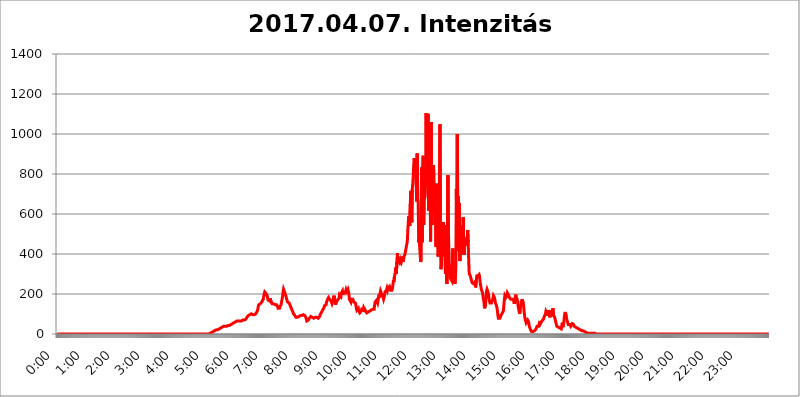
| Category | 2017.04.07. Intenzitás [W/m^2] |
|---|---|
| 0.0 | 0 |
| 0.0006944444444444445 | 0 |
| 0.001388888888888889 | 0 |
| 0.0020833333333333333 | 0 |
| 0.002777777777777778 | 0 |
| 0.003472222222222222 | 0 |
| 0.004166666666666667 | 0 |
| 0.004861111111111111 | 0 |
| 0.005555555555555556 | 0 |
| 0.0062499999999999995 | 0 |
| 0.006944444444444444 | 0 |
| 0.007638888888888889 | 0 |
| 0.008333333333333333 | 0 |
| 0.009027777777777779 | 0 |
| 0.009722222222222222 | 0 |
| 0.010416666666666666 | 0 |
| 0.011111111111111112 | 0 |
| 0.011805555555555555 | 0 |
| 0.012499999999999999 | 0 |
| 0.013194444444444444 | 0 |
| 0.013888888888888888 | 0 |
| 0.014583333333333332 | 0 |
| 0.015277777777777777 | 0 |
| 0.015972222222222224 | 0 |
| 0.016666666666666666 | 0 |
| 0.017361111111111112 | 0 |
| 0.018055555555555557 | 0 |
| 0.01875 | 0 |
| 0.019444444444444445 | 0 |
| 0.02013888888888889 | 0 |
| 0.020833333333333332 | 0 |
| 0.02152777777777778 | 0 |
| 0.022222222222222223 | 0 |
| 0.02291666666666667 | 0 |
| 0.02361111111111111 | 0 |
| 0.024305555555555556 | 0 |
| 0.024999999999999998 | 0 |
| 0.025694444444444447 | 0 |
| 0.02638888888888889 | 0 |
| 0.027083333333333334 | 0 |
| 0.027777777777777776 | 0 |
| 0.02847222222222222 | 0 |
| 0.029166666666666664 | 0 |
| 0.029861111111111113 | 0 |
| 0.030555555555555555 | 0 |
| 0.03125 | 0 |
| 0.03194444444444445 | 0 |
| 0.03263888888888889 | 0 |
| 0.03333333333333333 | 0 |
| 0.034027777777777775 | 0 |
| 0.034722222222222224 | 0 |
| 0.035416666666666666 | 0 |
| 0.036111111111111115 | 0 |
| 0.03680555555555556 | 0 |
| 0.0375 | 0 |
| 0.03819444444444444 | 0 |
| 0.03888888888888889 | 0 |
| 0.03958333333333333 | 0 |
| 0.04027777777777778 | 0 |
| 0.04097222222222222 | 0 |
| 0.041666666666666664 | 0 |
| 0.042361111111111106 | 0 |
| 0.04305555555555556 | 0 |
| 0.043750000000000004 | 0 |
| 0.044444444444444446 | 0 |
| 0.04513888888888889 | 0 |
| 0.04583333333333334 | 0 |
| 0.04652777777777778 | 0 |
| 0.04722222222222222 | 0 |
| 0.04791666666666666 | 0 |
| 0.04861111111111111 | 0 |
| 0.049305555555555554 | 0 |
| 0.049999999999999996 | 0 |
| 0.05069444444444445 | 0 |
| 0.051388888888888894 | 0 |
| 0.052083333333333336 | 0 |
| 0.05277777777777778 | 0 |
| 0.05347222222222222 | 0 |
| 0.05416666666666667 | 0 |
| 0.05486111111111111 | 0 |
| 0.05555555555555555 | 0 |
| 0.05625 | 0 |
| 0.05694444444444444 | 0 |
| 0.057638888888888885 | 0 |
| 0.05833333333333333 | 0 |
| 0.05902777777777778 | 0 |
| 0.059722222222222225 | 0 |
| 0.06041666666666667 | 0 |
| 0.061111111111111116 | 0 |
| 0.06180555555555556 | 0 |
| 0.0625 | 0 |
| 0.06319444444444444 | 0 |
| 0.06388888888888888 | 0 |
| 0.06458333333333334 | 0 |
| 0.06527777777777778 | 0 |
| 0.06597222222222222 | 0 |
| 0.06666666666666667 | 0 |
| 0.06736111111111111 | 0 |
| 0.06805555555555555 | 0 |
| 0.06874999999999999 | 0 |
| 0.06944444444444443 | 0 |
| 0.07013888888888889 | 0 |
| 0.07083333333333333 | 0 |
| 0.07152777777777779 | 0 |
| 0.07222222222222223 | 0 |
| 0.07291666666666667 | 0 |
| 0.07361111111111111 | 0 |
| 0.07430555555555556 | 0 |
| 0.075 | 0 |
| 0.07569444444444444 | 0 |
| 0.0763888888888889 | 0 |
| 0.07708333333333334 | 0 |
| 0.07777777777777778 | 0 |
| 0.07847222222222222 | 0 |
| 0.07916666666666666 | 0 |
| 0.0798611111111111 | 0 |
| 0.08055555555555556 | 0 |
| 0.08125 | 0 |
| 0.08194444444444444 | 0 |
| 0.08263888888888889 | 0 |
| 0.08333333333333333 | 0 |
| 0.08402777777777777 | 0 |
| 0.08472222222222221 | 0 |
| 0.08541666666666665 | 0 |
| 0.08611111111111112 | 0 |
| 0.08680555555555557 | 0 |
| 0.08750000000000001 | 0 |
| 0.08819444444444445 | 0 |
| 0.08888888888888889 | 0 |
| 0.08958333333333333 | 0 |
| 0.09027777777777778 | 0 |
| 0.09097222222222222 | 0 |
| 0.09166666666666667 | 0 |
| 0.09236111111111112 | 0 |
| 0.09305555555555556 | 0 |
| 0.09375 | 0 |
| 0.09444444444444444 | 0 |
| 0.09513888888888888 | 0 |
| 0.09583333333333333 | 0 |
| 0.09652777777777777 | 0 |
| 0.09722222222222222 | 0 |
| 0.09791666666666667 | 0 |
| 0.09861111111111111 | 0 |
| 0.09930555555555555 | 0 |
| 0.09999999999999999 | 0 |
| 0.10069444444444443 | 0 |
| 0.1013888888888889 | 0 |
| 0.10208333333333335 | 0 |
| 0.10277777777777779 | 0 |
| 0.10347222222222223 | 0 |
| 0.10416666666666667 | 0 |
| 0.10486111111111111 | 0 |
| 0.10555555555555556 | 0 |
| 0.10625 | 0 |
| 0.10694444444444444 | 0 |
| 0.1076388888888889 | 0 |
| 0.10833333333333334 | 0 |
| 0.10902777777777778 | 0 |
| 0.10972222222222222 | 0 |
| 0.1111111111111111 | 0 |
| 0.11180555555555556 | 0 |
| 0.11180555555555556 | 0 |
| 0.1125 | 0 |
| 0.11319444444444444 | 0 |
| 0.11388888888888889 | 0 |
| 0.11458333333333333 | 0 |
| 0.11527777777777777 | 0 |
| 0.11597222222222221 | 0 |
| 0.11666666666666665 | 0 |
| 0.1173611111111111 | 0 |
| 0.11805555555555557 | 0 |
| 0.11944444444444445 | 0 |
| 0.12013888888888889 | 0 |
| 0.12083333333333333 | 0 |
| 0.12152777777777778 | 0 |
| 0.12222222222222223 | 0 |
| 0.12291666666666667 | 0 |
| 0.12291666666666667 | 0 |
| 0.12361111111111112 | 0 |
| 0.12430555555555556 | 0 |
| 0.125 | 0 |
| 0.12569444444444444 | 0 |
| 0.12638888888888888 | 0 |
| 0.12708333333333333 | 0 |
| 0.16875 | 0 |
| 0.12847222222222224 | 0 |
| 0.12916666666666668 | 0 |
| 0.12986111111111112 | 0 |
| 0.13055555555555556 | 0 |
| 0.13125 | 0 |
| 0.13194444444444445 | 0 |
| 0.1326388888888889 | 0 |
| 0.13333333333333333 | 0 |
| 0.13402777777777777 | 0 |
| 0.13402777777777777 | 0 |
| 0.13472222222222222 | 0 |
| 0.13541666666666666 | 0 |
| 0.1361111111111111 | 0 |
| 0.13749999999999998 | 0 |
| 0.13819444444444443 | 0 |
| 0.1388888888888889 | 0 |
| 0.13958333333333334 | 0 |
| 0.14027777777777778 | 0 |
| 0.14097222222222222 | 0 |
| 0.14166666666666666 | 0 |
| 0.1423611111111111 | 0 |
| 0.14305555555555557 | 0 |
| 0.14375000000000002 | 0 |
| 0.14444444444444446 | 0 |
| 0.1451388888888889 | 0 |
| 0.1451388888888889 | 0 |
| 0.14652777777777778 | 0 |
| 0.14722222222222223 | 0 |
| 0.14791666666666667 | 0 |
| 0.1486111111111111 | 0 |
| 0.14930555555555555 | 0 |
| 0.15 | 0 |
| 0.15069444444444444 | 0 |
| 0.15138888888888888 | 0 |
| 0.15208333333333332 | 0 |
| 0.15277777777777776 | 0 |
| 0.15347222222222223 | 0 |
| 0.15416666666666667 | 0 |
| 0.15486111111111112 | 0 |
| 0.15555555555555556 | 0 |
| 0.15625 | 0 |
| 0.15694444444444444 | 0 |
| 0.15763888888888888 | 0 |
| 0.15833333333333333 | 0 |
| 0.15902777777777777 | 0 |
| 0.15972222222222224 | 0 |
| 0.16041666666666668 | 0 |
| 0.16111111111111112 | 0 |
| 0.16180555555555556 | 0 |
| 0.1625 | 0 |
| 0.16319444444444445 | 0 |
| 0.1638888888888889 | 0 |
| 0.16458333333333333 | 0 |
| 0.16527777777777777 | 0 |
| 0.16597222222222222 | 0 |
| 0.16666666666666666 | 0 |
| 0.1673611111111111 | 0 |
| 0.16805555555555554 | 0 |
| 0.16874999999999998 | 0 |
| 0.16944444444444443 | 0 |
| 0.17013888888888887 | 0 |
| 0.1708333333333333 | 0 |
| 0.17152777777777775 | 0 |
| 0.17222222222222225 | 0 |
| 0.1729166666666667 | 0 |
| 0.17361111111111113 | 0 |
| 0.17430555555555557 | 0 |
| 0.17500000000000002 | 0 |
| 0.17569444444444446 | 0 |
| 0.1763888888888889 | 0 |
| 0.17708333333333334 | 0 |
| 0.17777777777777778 | 0 |
| 0.17847222222222223 | 0 |
| 0.17916666666666667 | 0 |
| 0.1798611111111111 | 0 |
| 0.18055555555555555 | 0 |
| 0.18125 | 0 |
| 0.18194444444444444 | 0 |
| 0.1826388888888889 | 0 |
| 0.18333333333333335 | 0 |
| 0.1840277777777778 | 0 |
| 0.18472222222222223 | 0 |
| 0.18541666666666667 | 0 |
| 0.18611111111111112 | 0 |
| 0.18680555555555556 | 0 |
| 0.1875 | 0 |
| 0.18819444444444444 | 0 |
| 0.18888888888888888 | 0 |
| 0.18958333333333333 | 0 |
| 0.19027777777777777 | 0 |
| 0.1909722222222222 | 0 |
| 0.19166666666666665 | 0 |
| 0.19236111111111112 | 0 |
| 0.19305555555555554 | 0 |
| 0.19375 | 0 |
| 0.19444444444444445 | 0 |
| 0.1951388888888889 | 0 |
| 0.19583333333333333 | 0 |
| 0.19652777777777777 | 0 |
| 0.19722222222222222 | 0 |
| 0.19791666666666666 | 0 |
| 0.1986111111111111 | 0 |
| 0.19930555555555554 | 0 |
| 0.19999999999999998 | 0 |
| 0.20069444444444443 | 0 |
| 0.20138888888888887 | 0 |
| 0.2020833333333333 | 0 |
| 0.2027777777777778 | 0 |
| 0.2034722222222222 | 0 |
| 0.2041666666666667 | 0 |
| 0.20486111111111113 | 0 |
| 0.20555555555555557 | 0 |
| 0.20625000000000002 | 0 |
| 0.20694444444444446 | 0 |
| 0.2076388888888889 | 0 |
| 0.20833333333333334 | 0 |
| 0.20902777777777778 | 0 |
| 0.20972222222222223 | 0 |
| 0.21041666666666667 | 0 |
| 0.2111111111111111 | 0 |
| 0.21180555555555555 | 0 |
| 0.2125 | 0 |
| 0.21319444444444444 | 0 |
| 0.2138888888888889 | 3.525 |
| 0.21458333333333335 | 3.525 |
| 0.2152777777777778 | 3.525 |
| 0.21597222222222223 | 3.525 |
| 0.21666666666666667 | 7.887 |
| 0.21736111111111112 | 7.887 |
| 0.21805555555555556 | 12.257 |
| 0.21875 | 12.257 |
| 0.21944444444444444 | 12.257 |
| 0.22013888888888888 | 16.636 |
| 0.22083333333333333 | 16.636 |
| 0.22152777777777777 | 16.636 |
| 0.2222222222222222 | 16.636 |
| 0.22291666666666665 | 21.024 |
| 0.2236111111111111 | 21.024 |
| 0.22430555555555556 | 21.024 |
| 0.225 | 21.024 |
| 0.22569444444444445 | 21.024 |
| 0.2263888888888889 | 25.419 |
| 0.22708333333333333 | 25.419 |
| 0.22777777777777777 | 25.419 |
| 0.22847222222222222 | 29.823 |
| 0.22916666666666666 | 29.823 |
| 0.2298611111111111 | 29.823 |
| 0.23055555555555554 | 34.234 |
| 0.23124999999999998 | 34.234 |
| 0.23194444444444443 | 38.653 |
| 0.23263888888888887 | 38.653 |
| 0.2333333333333333 | 38.653 |
| 0.2340277777777778 | 38.653 |
| 0.2347222222222222 | 38.653 |
| 0.2354166666666667 | 38.653 |
| 0.23611111111111113 | 38.653 |
| 0.23680555555555557 | 38.653 |
| 0.23750000000000002 | 38.653 |
| 0.23819444444444446 | 38.653 |
| 0.2388888888888889 | 43.079 |
| 0.23958333333333334 | 43.079 |
| 0.24027777777777778 | 43.079 |
| 0.24097222222222223 | 43.079 |
| 0.24166666666666667 | 43.079 |
| 0.2423611111111111 | 43.079 |
| 0.24305555555555555 | 43.079 |
| 0.24375 | 47.511 |
| 0.24444444444444446 | 47.511 |
| 0.24513888888888888 | 47.511 |
| 0.24583333333333335 | 51.951 |
| 0.2465277777777778 | 51.951 |
| 0.24722222222222223 | 56.398 |
| 0.24791666666666667 | 56.398 |
| 0.24861111111111112 | 56.398 |
| 0.24930555555555556 | 56.398 |
| 0.25 | 60.85 |
| 0.25069444444444444 | 60.85 |
| 0.2513888888888889 | 65.31 |
| 0.2520833333333333 | 65.31 |
| 0.25277777777777777 | 65.31 |
| 0.2534722222222222 | 65.31 |
| 0.25416666666666665 | 65.31 |
| 0.2548611111111111 | 65.31 |
| 0.2555555555555556 | 65.31 |
| 0.25625000000000003 | 65.31 |
| 0.2569444444444445 | 65.31 |
| 0.2576388888888889 | 65.31 |
| 0.25833333333333336 | 65.31 |
| 0.2590277777777778 | 65.31 |
| 0.25972222222222224 | 69.775 |
| 0.2604166666666667 | 69.775 |
| 0.2611111111111111 | 69.775 |
| 0.26180555555555557 | 69.775 |
| 0.2625 | 69.775 |
| 0.26319444444444445 | 74.246 |
| 0.2638888888888889 | 74.246 |
| 0.26458333333333334 | 74.246 |
| 0.2652777777777778 | 78.722 |
| 0.2659722222222222 | 83.205 |
| 0.26666666666666666 | 83.205 |
| 0.2673611111111111 | 87.692 |
| 0.26805555555555555 | 92.184 |
| 0.26875 | 92.184 |
| 0.26944444444444443 | 96.682 |
| 0.2701388888888889 | 96.682 |
| 0.2708333333333333 | 96.682 |
| 0.27152777777777776 | 101.184 |
| 0.2722222222222222 | 101.184 |
| 0.27291666666666664 | 101.184 |
| 0.2736111111111111 | 101.184 |
| 0.2743055555555555 | 96.682 |
| 0.27499999999999997 | 96.682 |
| 0.27569444444444446 | 96.682 |
| 0.27638888888888885 | 96.682 |
| 0.27708333333333335 | 96.682 |
| 0.2777777777777778 | 96.682 |
| 0.27847222222222223 | 101.184 |
| 0.2791666666666667 | 101.184 |
| 0.2798611111111111 | 105.69 |
| 0.28055555555555556 | 114.716 |
| 0.28125 | 123.758 |
| 0.28194444444444444 | 137.347 |
| 0.2826388888888889 | 146.423 |
| 0.2833333333333333 | 150.964 |
| 0.28402777777777777 | 150.964 |
| 0.2847222222222222 | 150.964 |
| 0.28541666666666665 | 150.964 |
| 0.28611111111111115 | 155.509 |
| 0.28680555555555554 | 160.056 |
| 0.28750000000000003 | 164.605 |
| 0.2881944444444445 | 164.605 |
| 0.2888888888888889 | 173.709 |
| 0.28958333333333336 | 187.378 |
| 0.2902777777777778 | 201.058 |
| 0.29097222222222224 | 210.182 |
| 0.2916666666666667 | 214.746 |
| 0.2923611111111111 | 210.182 |
| 0.29305555555555557 | 201.058 |
| 0.29375 | 196.497 |
| 0.29444444444444445 | 191.937 |
| 0.2951388888888889 | 178.264 |
| 0.29583333333333334 | 169.156 |
| 0.2965277777777778 | 173.709 |
| 0.2972222222222222 | 164.605 |
| 0.29791666666666666 | 164.605 |
| 0.2986111111111111 | 178.264 |
| 0.29930555555555555 | 173.709 |
| 0.3 | 160.056 |
| 0.30069444444444443 | 155.509 |
| 0.3013888888888889 | 150.964 |
| 0.3020833333333333 | 150.964 |
| 0.30277777777777776 | 155.509 |
| 0.3034722222222222 | 150.964 |
| 0.30416666666666664 | 150.964 |
| 0.3048611111111111 | 146.423 |
| 0.3055555555555555 | 146.423 |
| 0.30624999999999997 | 150.964 |
| 0.3069444444444444 | 146.423 |
| 0.3076388888888889 | 146.423 |
| 0.30833333333333335 | 141.884 |
| 0.3090277777777778 | 137.347 |
| 0.30972222222222223 | 128.284 |
| 0.3104166666666667 | 128.284 |
| 0.3111111111111111 | 128.284 |
| 0.31180555555555556 | 128.284 |
| 0.3125 | 137.347 |
| 0.31319444444444444 | 141.884 |
| 0.3138888888888889 | 146.423 |
| 0.3145833333333333 | 160.056 |
| 0.31527777777777777 | 173.709 |
| 0.3159722222222222 | 187.378 |
| 0.31666666666666665 | 210.182 |
| 0.31736111111111115 | 223.873 |
| 0.31805555555555554 | 219.309 |
| 0.31875000000000003 | 210.182 |
| 0.3194444444444445 | 205.62 |
| 0.3201388888888889 | 196.497 |
| 0.32083333333333336 | 187.378 |
| 0.3215277777777778 | 178.264 |
| 0.32222222222222224 | 169.156 |
| 0.3229166666666667 | 160.056 |
| 0.3236111111111111 | 160.056 |
| 0.32430555555555557 | 155.509 |
| 0.325 | 155.509 |
| 0.32569444444444445 | 150.964 |
| 0.3263888888888889 | 146.423 |
| 0.32708333333333334 | 137.347 |
| 0.3277777777777778 | 132.814 |
| 0.3284722222222222 | 128.284 |
| 0.32916666666666666 | 119.235 |
| 0.3298611111111111 | 114.716 |
| 0.33055555555555555 | 110.201 |
| 0.33125 | 101.184 |
| 0.33194444444444443 | 101.184 |
| 0.3326388888888889 | 96.682 |
| 0.3333333333333333 | 92.184 |
| 0.3340277777777778 | 87.692 |
| 0.3347222222222222 | 83.205 |
| 0.3354166666666667 | 83.205 |
| 0.3361111111111111 | 83.205 |
| 0.3368055555555556 | 83.205 |
| 0.33749999999999997 | 83.205 |
| 0.33819444444444446 | 87.692 |
| 0.33888888888888885 | 87.692 |
| 0.33958333333333335 | 87.692 |
| 0.34027777777777773 | 92.184 |
| 0.34097222222222223 | 92.184 |
| 0.3416666666666666 | 96.682 |
| 0.3423611111111111 | 92.184 |
| 0.3430555555555555 | 92.184 |
| 0.34375 | 92.184 |
| 0.3444444444444445 | 96.682 |
| 0.3451388888888889 | 96.682 |
| 0.3458333333333334 | 96.682 |
| 0.34652777777777777 | 96.682 |
| 0.34722222222222227 | 92.184 |
| 0.34791666666666665 | 87.692 |
| 0.34861111111111115 | 83.205 |
| 0.34930555555555554 | 74.246 |
| 0.35000000000000003 | 65.31 |
| 0.3506944444444444 | 65.31 |
| 0.3513888888888889 | 65.31 |
| 0.3520833333333333 | 69.775 |
| 0.3527777777777778 | 74.246 |
| 0.3534722222222222 | 78.722 |
| 0.3541666666666667 | 83.205 |
| 0.3548611111111111 | 83.205 |
| 0.35555555555555557 | 87.692 |
| 0.35625 | 87.692 |
| 0.35694444444444445 | 83.205 |
| 0.3576388888888889 | 83.205 |
| 0.35833333333333334 | 83.205 |
| 0.3590277777777778 | 83.205 |
| 0.3597222222222222 | 78.722 |
| 0.36041666666666666 | 78.722 |
| 0.3611111111111111 | 78.722 |
| 0.36180555555555555 | 83.205 |
| 0.3625 | 83.205 |
| 0.36319444444444443 | 83.205 |
| 0.3638888888888889 | 83.205 |
| 0.3645833333333333 | 83.205 |
| 0.3652777777777778 | 78.722 |
| 0.3659722222222222 | 78.722 |
| 0.3666666666666667 | 74.246 |
| 0.3673611111111111 | 78.722 |
| 0.3680555555555556 | 87.692 |
| 0.36874999999999997 | 96.682 |
| 0.36944444444444446 | 96.682 |
| 0.37013888888888885 | 101.184 |
| 0.37083333333333335 | 110.201 |
| 0.37152777777777773 | 114.716 |
| 0.37222222222222223 | 119.235 |
| 0.3729166666666666 | 123.758 |
| 0.3736111111111111 | 128.284 |
| 0.3743055555555555 | 132.814 |
| 0.375 | 141.884 |
| 0.3756944444444445 | 146.423 |
| 0.3763888888888889 | 146.423 |
| 0.3770833333333334 | 146.423 |
| 0.37777777777777777 | 160.056 |
| 0.37847222222222227 | 164.605 |
| 0.37916666666666665 | 173.709 |
| 0.37986111111111115 | 178.264 |
| 0.38055555555555554 | 182.82 |
| 0.38125000000000003 | 187.378 |
| 0.3819444444444444 | 173.709 |
| 0.3826388888888889 | 169.156 |
| 0.3833333333333333 | 169.156 |
| 0.3840277777777778 | 164.605 |
| 0.3847222222222222 | 164.605 |
| 0.3854166666666667 | 150.964 |
| 0.3861111111111111 | 155.509 |
| 0.38680555555555557 | 164.605 |
| 0.3875 | 182.82 |
| 0.38819444444444445 | 191.937 |
| 0.3888888888888889 | 187.378 |
| 0.38958333333333334 | 164.605 |
| 0.3902777777777778 | 146.423 |
| 0.3909722222222222 | 155.509 |
| 0.39166666666666666 | 160.056 |
| 0.3923611111111111 | 160.056 |
| 0.39305555555555555 | 169.156 |
| 0.39375 | 164.605 |
| 0.39444444444444443 | 164.605 |
| 0.3951388888888889 | 178.264 |
| 0.3958333333333333 | 196.497 |
| 0.3965277777777778 | 196.497 |
| 0.3972222222222222 | 191.937 |
| 0.3979166666666667 | 187.378 |
| 0.3986111111111111 | 205.62 |
| 0.3993055555555556 | 210.182 |
| 0.39999999999999997 | 214.746 |
| 0.40069444444444446 | 196.497 |
| 0.40138888888888885 | 196.497 |
| 0.40208333333333335 | 210.182 |
| 0.40277777777777773 | 205.62 |
| 0.40347222222222223 | 214.746 |
| 0.4041666666666666 | 210.182 |
| 0.4048611111111111 | 219.309 |
| 0.4055555555555555 | 210.182 |
| 0.40625 | 205.62 |
| 0.4069444444444445 | 210.182 |
| 0.4076388888888889 | 223.873 |
| 0.4083333333333334 | 228.436 |
| 0.40902777777777777 | 201.058 |
| 0.40972222222222227 | 173.709 |
| 0.41041666666666665 | 169.156 |
| 0.41111111111111115 | 173.709 |
| 0.41180555555555554 | 160.056 |
| 0.41250000000000003 | 173.709 |
| 0.4131944444444444 | 178.264 |
| 0.4138888888888889 | 173.709 |
| 0.4145833333333333 | 173.709 |
| 0.4152777777777778 | 169.156 |
| 0.4159722222222222 | 160.056 |
| 0.4166666666666667 | 160.056 |
| 0.4173611111111111 | 155.509 |
| 0.41805555555555557 | 155.509 |
| 0.41875 | 146.423 |
| 0.41944444444444445 | 128.284 |
| 0.4201388888888889 | 119.235 |
| 0.42083333333333334 | 114.716 |
| 0.4215277777777778 | 123.758 |
| 0.4222222222222222 | 128.284 |
| 0.42291666666666666 | 114.716 |
| 0.4236111111111111 | 110.201 |
| 0.42430555555555555 | 105.69 |
| 0.425 | 101.184 |
| 0.42569444444444443 | 101.184 |
| 0.4263888888888889 | 114.716 |
| 0.4270833333333333 | 123.758 |
| 0.4277777777777778 | 123.758 |
| 0.4284722222222222 | 123.758 |
| 0.4291666666666667 | 119.235 |
| 0.4298611111111111 | 132.814 |
| 0.4305555555555556 | 132.814 |
| 0.43124999999999997 | 123.758 |
| 0.43194444444444446 | 119.235 |
| 0.43263888888888885 | 114.716 |
| 0.43333333333333335 | 110.201 |
| 0.43402777777777773 | 105.69 |
| 0.43472222222222223 | 110.201 |
| 0.4354166666666666 | 105.69 |
| 0.4361111111111111 | 110.201 |
| 0.4368055555555555 | 114.716 |
| 0.4375 | 114.716 |
| 0.4381944444444445 | 114.716 |
| 0.4388888888888889 | 114.716 |
| 0.4395833333333334 | 114.716 |
| 0.44027777777777777 | 119.235 |
| 0.44097222222222227 | 123.758 |
| 0.44166666666666665 | 123.758 |
| 0.44236111111111115 | 123.758 |
| 0.44305555555555554 | 119.235 |
| 0.44375000000000003 | 119.235 |
| 0.4444444444444444 | 123.758 |
| 0.4451388888888889 | 146.423 |
| 0.4458333333333333 | 160.056 |
| 0.4465277777777778 | 164.605 |
| 0.4472222222222222 | 164.605 |
| 0.4479166666666667 | 169.156 |
| 0.4486111111111111 | 164.605 |
| 0.44930555555555557 | 155.509 |
| 0.45 | 169.156 |
| 0.45069444444444445 | 187.378 |
| 0.4513888888888889 | 196.497 |
| 0.45208333333333334 | 182.82 |
| 0.4527777777777778 | 201.058 |
| 0.4534722222222222 | 214.746 |
| 0.45416666666666666 | 210.182 |
| 0.4548611111111111 | 201.058 |
| 0.45555555555555555 | 205.62 |
| 0.45625 | 191.937 |
| 0.45694444444444443 | 182.82 |
| 0.4576388888888889 | 173.709 |
| 0.4583333333333333 | 182.82 |
| 0.4590277777777778 | 191.937 |
| 0.4597222222222222 | 210.182 |
| 0.4604166666666667 | 205.62 |
| 0.4611111111111111 | 214.746 |
| 0.4618055555555556 | 219.309 |
| 0.46249999999999997 | 228.436 |
| 0.46319444444444446 | 219.309 |
| 0.46388888888888885 | 228.436 |
| 0.46458333333333335 | 233 |
| 0.46527777777777773 | 228.436 |
| 0.46597222222222223 | 237.564 |
| 0.4666666666666666 | 228.436 |
| 0.4673611111111111 | 219.309 |
| 0.4680555555555555 | 219.309 |
| 0.46875 | 223.873 |
| 0.4694444444444445 | 219.309 |
| 0.4701388888888889 | 228.436 |
| 0.4708333333333334 | 246.689 |
| 0.47152777777777777 | 269.49 |
| 0.47222222222222227 | 260.373 |
| 0.47291666666666665 | 287.709 |
| 0.47361111111111115 | 296.808 |
| 0.47430555555555554 | 296.808 |
| 0.47500000000000003 | 333.113 |
| 0.4756944444444444 | 301.354 |
| 0.4763888888888889 | 364.728 |
| 0.4770833333333333 | 405.108 |
| 0.4777777777777778 | 364.728 |
| 0.4784722222222222 | 364.728 |
| 0.4791666666666667 | 360.221 |
| 0.4798611111111111 | 355.712 |
| 0.48055555555555557 | 360.221 |
| 0.48125 | 373.729 |
| 0.48194444444444445 | 369.23 |
| 0.4826388888888889 | 360.221 |
| 0.48333333333333334 | 369.23 |
| 0.4840277777777778 | 387.202 |
| 0.4847222222222222 | 373.729 |
| 0.48541666666666666 | 360.221 |
| 0.4861111111111111 | 387.202 |
| 0.48680555555555555 | 387.202 |
| 0.4875 | 396.164 |
| 0.48819444444444443 | 409.574 |
| 0.4888888888888889 | 422.943 |
| 0.4895833333333333 | 422.943 |
| 0.4902777777777778 | 427.39 |
| 0.4909722222222222 | 462.786 |
| 0.4916666666666667 | 515.223 |
| 0.4923611111111111 | 558.261 |
| 0.4930555555555556 | 588.009 |
| 0.49374999999999997 | 583.779 |
| 0.49444444444444446 | 541.121 |
| 0.49513888888888885 | 650.667 |
| 0.49583333333333335 | 715.858 |
| 0.49652777777777773 | 715.858 |
| 0.49722222222222223 | 558.261 |
| 0.4979166666666666 | 723.889 |
| 0.4986111111111111 | 751.803 |
| 0.4993055555555555 | 791.169 |
| 0.5 | 845.365 |
| 0.5006944444444444 | 879.719 |
| 0.5013888888888889 | 833.834 |
| 0.5020833333333333 | 806.757 |
| 0.5027777777777778 | 864.493 |
| 0.5034722222222222 | 743.859 |
| 0.5041666666666667 | 663.019 |
| 0.5048611111111111 | 902.447 |
| 0.5055555555555555 | 691.608 |
| 0.50625 | 654.791 |
| 0.5069444444444444 | 458.38 |
| 0.5076388888888889 | 475.972 |
| 0.5083333333333333 | 436.27 |
| 0.5090277777777777 | 396.164 |
| 0.5097222222222222 | 360.221 |
| 0.5104166666666666 | 373.729 |
| 0.5111111111111112 | 833.834 |
| 0.5118055555555555 | 458.38 |
| 0.5125000000000001 | 814.519 |
| 0.5131944444444444 | 891.099 |
| 0.513888888888889 | 545.416 |
| 0.5145833333333333 | 671.22 |
| 0.5152777777777778 | 679.395 |
| 0.5159722222222222 | 687.544 |
| 0.5166666666666667 | 763.674 |
| 0.517361111111111 | 1105.019 |
| 0.5180555555555556 | 791.169 |
| 0.5187499999999999 | 814.519 |
| 0.5194444444444445 | 887.309 |
| 0.5201388888888888 | 1101.226 |
| 0.5208333333333334 | 617.436 |
| 0.5215277777777778 | 868.305 |
| 0.5222222222222223 | 806.757 |
| 0.5229166666666667 | 759.723 |
| 0.5236111111111111 | 462.786 |
| 0.5243055555555556 | 1059.756 |
| 0.525 | 638.256 |
| 0.5256944444444445 | 545.416 |
| 0.5263888888888889 | 747.834 |
| 0.5270833333333333 | 609.062 |
| 0.5277777777777778 | 845.365 |
| 0.5284722222222222 | 703.762 |
| 0.5291666666666667 | 663.019 |
| 0.5298611111111111 | 638.256 |
| 0.5305555555555556 | 549.704 |
| 0.53125 | 436.27 |
| 0.5319444444444444 | 751.803 |
| 0.5326388888888889 | 663.019 |
| 0.5333333333333333 | 480.356 |
| 0.5340277777777778 | 387.202 |
| 0.5347222222222222 | 405.108 |
| 0.5354166666666667 | 489.108 |
| 0.5361111111111111 | 791.169 |
| 0.5368055555555555 | 1048.508 |
| 0.5375 | 458.38 |
| 0.5381944444444444 | 324.052 |
| 0.5388888888888889 | 351.198 |
| 0.5395833333333333 | 405.108 |
| 0.5402777777777777 | 489.108 |
| 0.5409722222222222 | 427.39 |
| 0.5416666666666666 | 558.261 |
| 0.5423611111111112 | 471.582 |
| 0.5430555555555555 | 387.202 |
| 0.5437500000000001 | 545.416 |
| 0.5444444444444444 | 301.354 |
| 0.545138888888889 | 305.898 |
| 0.5458333333333333 | 324.052 |
| 0.5465277777777778 | 251.251 |
| 0.5472222222222222 | 251.251 |
| 0.5479166666666667 | 795.074 |
| 0.548611111111111 | 515.223 |
| 0.5493055555555556 | 418.492 |
| 0.5499999999999999 | 324.052 |
| 0.5506944444444445 | 287.709 |
| 0.5513888888888888 | 278.603 |
| 0.5520833333333334 | 274.047 |
| 0.5527777777777778 | 274.047 |
| 0.5534722222222223 | 264.932 |
| 0.5541666666666667 | 264.932 |
| 0.5548611111111111 | 427.39 |
| 0.5555555555555556 | 296.808 |
| 0.55625 | 278.603 |
| 0.5569444444444445 | 260.373 |
| 0.5576388888888889 | 251.251 |
| 0.5583333333333333 | 264.932 |
| 0.5590277777777778 | 342.162 |
| 0.5597222222222222 | 723.889 |
| 0.5604166666666667 | 545.416 |
| 0.5611111111111111 | 999.916 |
| 0.5618055555555556 | 532.513 |
| 0.5625 | 687.544 |
| 0.5631944444444444 | 414.035 |
| 0.5638888888888889 | 654.791 |
| 0.5645833333333333 | 364.728 |
| 0.5652777777777778 | 378.224 |
| 0.5659722222222222 | 519.555 |
| 0.5666666666666667 | 541.121 |
| 0.5673611111111111 | 422.943 |
| 0.5680555555555555 | 528.2 |
| 0.56875 | 396.164 |
| 0.5694444444444444 | 583.779 |
| 0.5701388888888889 | 453.968 |
| 0.5708333333333333 | 396.164 |
| 0.5715277777777777 | 480.356 |
| 0.5722222222222222 | 471.582 |
| 0.5729166666666666 | 458.38 |
| 0.5736111111111112 | 440.702 |
| 0.5743055555555555 | 453.968 |
| 0.5750000000000001 | 471.582 |
| 0.5756944444444444 | 519.555 |
| 0.576388888888889 | 458.38 |
| 0.5770833333333333 | 364.728 |
| 0.5777777777777778 | 301.354 |
| 0.5784722222222222 | 301.354 |
| 0.5791666666666667 | 292.259 |
| 0.579861111111111 | 283.156 |
| 0.5805555555555556 | 274.047 |
| 0.5812499999999999 | 264.932 |
| 0.5819444444444445 | 255.813 |
| 0.5826388888888888 | 260.373 |
| 0.5833333333333334 | 260.373 |
| 0.5840277777777778 | 251.251 |
| 0.5847222222222223 | 251.251 |
| 0.5854166666666667 | 255.813 |
| 0.5861111111111111 | 260.373 |
| 0.5868055555555556 | 233 |
| 0.5875 | 237.564 |
| 0.5881944444444445 | 283.156 |
| 0.5888888888888889 | 296.808 |
| 0.5895833333333333 | 287.709 |
| 0.5902777777777778 | 283.156 |
| 0.5909722222222222 | 283.156 |
| 0.5916666666666667 | 296.808 |
| 0.5923611111111111 | 287.709 |
| 0.5930555555555556 | 260.373 |
| 0.59375 | 255.813 |
| 0.5944444444444444 | 228.436 |
| 0.5951388888888889 | 219.309 |
| 0.5958333333333333 | 219.309 |
| 0.5965277777777778 | 205.62 |
| 0.5972222222222222 | 187.378 |
| 0.5979166666666667 | 173.709 |
| 0.5986111111111111 | 155.509 |
| 0.5993055555555555 | 128.284 |
| 0.6 | 123.758 |
| 0.6006944444444444 | 146.423 |
| 0.6013888888888889 | 191.937 |
| 0.6020833333333333 | 214.746 |
| 0.6027777777777777 | 223.873 |
| 0.6034722222222222 | 219.309 |
| 0.6041666666666666 | 210.182 |
| 0.6048611111111112 | 196.497 |
| 0.6055555555555555 | 178.264 |
| 0.6062500000000001 | 164.605 |
| 0.6069444444444444 | 155.509 |
| 0.607638888888889 | 155.509 |
| 0.6083333333333333 | 150.964 |
| 0.6090277777777778 | 155.509 |
| 0.6097222222222222 | 155.509 |
| 0.6104166666666667 | 160.056 |
| 0.611111111111111 | 178.264 |
| 0.6118055555555556 | 191.937 |
| 0.6124999999999999 | 196.497 |
| 0.6131944444444445 | 182.82 |
| 0.6138888888888888 | 169.156 |
| 0.6145833333333334 | 155.509 |
| 0.6152777777777778 | 155.509 |
| 0.6159722222222223 | 141.884 |
| 0.6166666666666667 | 132.814 |
| 0.6173611111111111 | 114.716 |
| 0.6180555555555556 | 92.184 |
| 0.61875 | 78.722 |
| 0.6194444444444445 | 78.722 |
| 0.6201388888888889 | 78.722 |
| 0.6208333333333333 | 78.722 |
| 0.6215277777777778 | 83.205 |
| 0.6222222222222222 | 92.184 |
| 0.6229166666666667 | 96.682 |
| 0.6236111111111111 | 101.184 |
| 0.6243055555555556 | 101.184 |
| 0.625 | 105.69 |
| 0.6256944444444444 | 114.716 |
| 0.6263888888888889 | 141.884 |
| 0.6270833333333333 | 173.709 |
| 0.6277777777777778 | 191.937 |
| 0.6284722222222222 | 191.937 |
| 0.6291666666666667 | 182.82 |
| 0.6298611111111111 | 182.82 |
| 0.6305555555555555 | 191.937 |
| 0.63125 | 205.62 |
| 0.6319444444444444 | 210.182 |
| 0.6326388888888889 | 201.058 |
| 0.6333333333333333 | 191.937 |
| 0.6340277777777777 | 182.82 |
| 0.6347222222222222 | 182.82 |
| 0.6354166666666666 | 178.264 |
| 0.6361111111111112 | 173.709 |
| 0.6368055555555555 | 173.709 |
| 0.6375000000000001 | 173.709 |
| 0.6381944444444444 | 173.709 |
| 0.638888888888889 | 173.709 |
| 0.6395833333333333 | 173.709 |
| 0.6402777777777778 | 164.605 |
| 0.6409722222222222 | 150.964 |
| 0.6416666666666667 | 146.423 |
| 0.642361111111111 | 155.509 |
| 0.6430555555555556 | 196.497 |
| 0.6437499999999999 | 182.82 |
| 0.6444444444444445 | 187.378 |
| 0.6451388888888888 | 173.709 |
| 0.6458333333333334 | 155.509 |
| 0.6465277777777778 | 137.347 |
| 0.6472222222222223 | 123.758 |
| 0.6479166666666667 | 110.201 |
| 0.6486111111111111 | 101.184 |
| 0.6493055555555556 | 119.235 |
| 0.65 | 141.884 |
| 0.6506944444444445 | 164.605 |
| 0.6513888888888889 | 155.509 |
| 0.6520833333333333 | 173.709 |
| 0.6527777777777778 | 169.156 |
| 0.6534722222222222 | 155.509 |
| 0.6541666666666667 | 137.347 |
| 0.6548611111111111 | 110.201 |
| 0.6555555555555556 | 87.692 |
| 0.65625 | 74.246 |
| 0.6569444444444444 | 65.31 |
| 0.6576388888888889 | 56.398 |
| 0.6583333333333333 | 51.951 |
| 0.6590277777777778 | 56.398 |
| 0.6597222222222222 | 69.775 |
| 0.6604166666666667 | 74.246 |
| 0.6611111111111111 | 60.85 |
| 0.6618055555555555 | 43.079 |
| 0.6625 | 34.234 |
| 0.6631944444444444 | 29.823 |
| 0.6638888888888889 | 21.024 |
| 0.6645833333333333 | 16.636 |
| 0.6652777777777777 | 12.257 |
| 0.6659722222222222 | 12.257 |
| 0.6666666666666666 | 12.257 |
| 0.6673611111111111 | 12.257 |
| 0.6680555555555556 | 12.257 |
| 0.6687500000000001 | 16.636 |
| 0.6694444444444444 | 16.636 |
| 0.6701388888888888 | 16.636 |
| 0.6708333333333334 | 21.024 |
| 0.6715277777777778 | 25.419 |
| 0.6722222222222222 | 29.823 |
| 0.6729166666666666 | 38.653 |
| 0.6736111111111112 | 38.653 |
| 0.6743055555555556 | 38.653 |
| 0.6749999999999999 | 38.653 |
| 0.6756944444444444 | 38.653 |
| 0.6763888888888889 | 43.079 |
| 0.6770833333333334 | 65.31 |
| 0.6777777777777777 | 51.951 |
| 0.6784722222222223 | 56.398 |
| 0.6791666666666667 | 56.398 |
| 0.6798611111111111 | 65.31 |
| 0.6805555555555555 | 65.31 |
| 0.68125 | 69.775 |
| 0.6819444444444445 | 74.246 |
| 0.6826388888888889 | 83.205 |
| 0.6833333333333332 | 78.722 |
| 0.6840277777777778 | 83.205 |
| 0.6847222222222222 | 101.184 |
| 0.6854166666666667 | 114.716 |
| 0.686111111111111 | 110.201 |
| 0.6868055555555556 | 105.69 |
| 0.6875 | 92.184 |
| 0.6881944444444444 | 87.692 |
| 0.688888888888889 | 119.235 |
| 0.6895833333333333 | 110.201 |
| 0.6902777777777778 | 92.184 |
| 0.6909722222222222 | 83.205 |
| 0.6916666666666668 | 101.184 |
| 0.6923611111111111 | 110.201 |
| 0.6930555555555555 | 87.692 |
| 0.69375 | 119.235 |
| 0.6944444444444445 | 101.184 |
| 0.6951388888888889 | 128.284 |
| 0.6958333333333333 | 96.682 |
| 0.6965277777777777 | 96.682 |
| 0.6972222222222223 | 87.692 |
| 0.6979166666666666 | 78.722 |
| 0.6986111111111111 | 69.775 |
| 0.6993055555555556 | 65.31 |
| 0.7000000000000001 | 47.511 |
| 0.7006944444444444 | 38.653 |
| 0.7013888888888888 | 34.234 |
| 0.7020833333333334 | 34.234 |
| 0.7027777777777778 | 34.234 |
| 0.7034722222222222 | 34.234 |
| 0.7041666666666666 | 29.823 |
| 0.7048611111111112 | 29.823 |
| 0.7055555555555556 | 29.823 |
| 0.7062499999999999 | 29.823 |
| 0.7069444444444444 | 25.419 |
| 0.7076388888888889 | 29.823 |
| 0.7083333333333334 | 56.398 |
| 0.7090277777777777 | 34.234 |
| 0.7097222222222223 | 34.234 |
| 0.7104166666666667 | 56.398 |
| 0.7111111111111111 | 83.205 |
| 0.7118055555555555 | 101.184 |
| 0.7125 | 110.201 |
| 0.7131944444444445 | 110.201 |
| 0.7138888888888889 | 87.692 |
| 0.7145833333333332 | 74.246 |
| 0.7152777777777778 | 65.31 |
| 0.7159722222222222 | 56.398 |
| 0.7166666666666667 | 47.511 |
| 0.717361111111111 | 47.511 |
| 0.7180555555555556 | 51.951 |
| 0.71875 | 47.511 |
| 0.7194444444444444 | 43.079 |
| 0.720138888888889 | 38.653 |
| 0.7208333333333333 | 43.079 |
| 0.7215277777777778 | 43.079 |
| 0.7222222222222222 | 51.951 |
| 0.7229166666666668 | 47.511 |
| 0.7236111111111111 | 47.511 |
| 0.7243055555555555 | 47.511 |
| 0.725 | 38.653 |
| 0.7256944444444445 | 38.653 |
| 0.7263888888888889 | 34.234 |
| 0.7270833333333333 | 34.234 |
| 0.7277777777777777 | 34.234 |
| 0.7284722222222223 | 29.823 |
| 0.7291666666666666 | 29.823 |
| 0.7298611111111111 | 29.823 |
| 0.7305555555555556 | 25.419 |
| 0.7312500000000001 | 25.419 |
| 0.7319444444444444 | 25.419 |
| 0.7326388888888888 | 25.419 |
| 0.7333333333333334 | 21.024 |
| 0.7340277777777778 | 21.024 |
| 0.7347222222222222 | 16.636 |
| 0.7354166666666666 | 16.636 |
| 0.7361111111111112 | 16.636 |
| 0.7368055555555556 | 16.636 |
| 0.7374999999999999 | 16.636 |
| 0.7381944444444444 | 12.257 |
| 0.7388888888888889 | 12.257 |
| 0.7395833333333334 | 12.257 |
| 0.7402777777777777 | 12.257 |
| 0.7409722222222223 | 7.887 |
| 0.7416666666666667 | 7.887 |
| 0.7423611111111111 | 7.887 |
| 0.7430555555555555 | 3.525 |
| 0.74375 | 3.525 |
| 0.7444444444444445 | 3.525 |
| 0.7451388888888889 | 3.525 |
| 0.7458333333333332 | 3.525 |
| 0.7465277777777778 | 3.525 |
| 0.7472222222222222 | 3.525 |
| 0.7479166666666667 | 3.525 |
| 0.748611111111111 | 3.525 |
| 0.7493055555555556 | 3.525 |
| 0.75 | 3.525 |
| 0.7506944444444444 | 3.525 |
| 0.751388888888889 | 3.525 |
| 0.7520833333333333 | 3.525 |
| 0.7527777777777778 | 0 |
| 0.7534722222222222 | 0 |
| 0.7541666666666668 | 3.525 |
| 0.7548611111111111 | 0 |
| 0.7555555555555555 | 0 |
| 0.75625 | 0 |
| 0.7569444444444445 | 0 |
| 0.7576388888888889 | 0 |
| 0.7583333333333333 | 0 |
| 0.7590277777777777 | 0 |
| 0.7597222222222223 | 0 |
| 0.7604166666666666 | 0 |
| 0.7611111111111111 | 0 |
| 0.7618055555555556 | 0 |
| 0.7625000000000001 | 0 |
| 0.7631944444444444 | 0 |
| 0.7638888888888888 | 0 |
| 0.7645833333333334 | 0 |
| 0.7652777777777778 | 0 |
| 0.7659722222222222 | 0 |
| 0.7666666666666666 | 0 |
| 0.7673611111111112 | 0 |
| 0.7680555555555556 | 0 |
| 0.7687499999999999 | 0 |
| 0.7694444444444444 | 0 |
| 0.7701388888888889 | 0 |
| 0.7708333333333334 | 0 |
| 0.7715277777777777 | 0 |
| 0.7722222222222223 | 0 |
| 0.7729166666666667 | 0 |
| 0.7736111111111111 | 0 |
| 0.7743055555555555 | 0 |
| 0.775 | 0 |
| 0.7756944444444445 | 0 |
| 0.7763888888888889 | 0 |
| 0.7770833333333332 | 0 |
| 0.7777777777777778 | 0 |
| 0.7784722222222222 | 0 |
| 0.7791666666666667 | 0 |
| 0.779861111111111 | 0 |
| 0.7805555555555556 | 0 |
| 0.78125 | 0 |
| 0.7819444444444444 | 0 |
| 0.782638888888889 | 0 |
| 0.7833333333333333 | 0 |
| 0.7840277777777778 | 0 |
| 0.7847222222222222 | 0 |
| 0.7854166666666668 | 0 |
| 0.7861111111111111 | 0 |
| 0.7868055555555555 | 0 |
| 0.7875 | 0 |
| 0.7881944444444445 | 0 |
| 0.7888888888888889 | 0 |
| 0.7895833333333333 | 0 |
| 0.7902777777777777 | 0 |
| 0.7909722222222223 | 0 |
| 0.7916666666666666 | 0 |
| 0.7923611111111111 | 0 |
| 0.7930555555555556 | 0 |
| 0.7937500000000001 | 0 |
| 0.7944444444444444 | 0 |
| 0.7951388888888888 | 0 |
| 0.7958333333333334 | 0 |
| 0.7965277777777778 | 0 |
| 0.7972222222222222 | 0 |
| 0.7979166666666666 | 0 |
| 0.7986111111111112 | 0 |
| 0.7993055555555556 | 0 |
| 0.7999999999999999 | 0 |
| 0.8006944444444444 | 0 |
| 0.8013888888888889 | 0 |
| 0.8020833333333334 | 0 |
| 0.8027777777777777 | 0 |
| 0.8034722222222223 | 0 |
| 0.8041666666666667 | 0 |
| 0.8048611111111111 | 0 |
| 0.8055555555555555 | 0 |
| 0.80625 | 0 |
| 0.8069444444444445 | 0 |
| 0.8076388888888889 | 0 |
| 0.8083333333333332 | 0 |
| 0.8090277777777778 | 0 |
| 0.8097222222222222 | 0 |
| 0.8104166666666667 | 0 |
| 0.811111111111111 | 0 |
| 0.8118055555555556 | 0 |
| 0.8125 | 0 |
| 0.8131944444444444 | 0 |
| 0.813888888888889 | 0 |
| 0.8145833333333333 | 0 |
| 0.8152777777777778 | 0 |
| 0.8159722222222222 | 0 |
| 0.8166666666666668 | 0 |
| 0.8173611111111111 | 0 |
| 0.8180555555555555 | 0 |
| 0.81875 | 0 |
| 0.8194444444444445 | 0 |
| 0.8201388888888889 | 0 |
| 0.8208333333333333 | 0 |
| 0.8215277777777777 | 0 |
| 0.8222222222222223 | 0 |
| 0.8229166666666666 | 0 |
| 0.8236111111111111 | 0 |
| 0.8243055555555556 | 0 |
| 0.8250000000000001 | 0 |
| 0.8256944444444444 | 0 |
| 0.8263888888888888 | 0 |
| 0.8270833333333334 | 0 |
| 0.8277777777777778 | 0 |
| 0.8284722222222222 | 0 |
| 0.8291666666666666 | 0 |
| 0.8298611111111112 | 0 |
| 0.8305555555555556 | 0 |
| 0.8312499999999999 | 0 |
| 0.8319444444444444 | 0 |
| 0.8326388888888889 | 0 |
| 0.8333333333333334 | 0 |
| 0.8340277777777777 | 0 |
| 0.8347222222222223 | 0 |
| 0.8354166666666667 | 0 |
| 0.8361111111111111 | 0 |
| 0.8368055555555555 | 0 |
| 0.8375 | 0 |
| 0.8381944444444445 | 0 |
| 0.8388888888888889 | 0 |
| 0.8395833333333332 | 0 |
| 0.8402777777777778 | 0 |
| 0.8409722222222222 | 0 |
| 0.8416666666666667 | 0 |
| 0.842361111111111 | 0 |
| 0.8430555555555556 | 0 |
| 0.84375 | 0 |
| 0.8444444444444444 | 0 |
| 0.845138888888889 | 0 |
| 0.8458333333333333 | 0 |
| 0.8465277777777778 | 0 |
| 0.8472222222222222 | 0 |
| 0.8479166666666668 | 0 |
| 0.8486111111111111 | 0 |
| 0.8493055555555555 | 0 |
| 0.85 | 0 |
| 0.8506944444444445 | 0 |
| 0.8513888888888889 | 0 |
| 0.8520833333333333 | 0 |
| 0.8527777777777777 | 0 |
| 0.8534722222222223 | 0 |
| 0.8541666666666666 | 0 |
| 0.8548611111111111 | 0 |
| 0.8555555555555556 | 0 |
| 0.8562500000000001 | 0 |
| 0.8569444444444444 | 0 |
| 0.8576388888888888 | 0 |
| 0.8583333333333334 | 0 |
| 0.8590277777777778 | 0 |
| 0.8597222222222222 | 0 |
| 0.8604166666666666 | 0 |
| 0.8611111111111112 | 0 |
| 0.8618055555555556 | 0 |
| 0.8624999999999999 | 0 |
| 0.8631944444444444 | 0 |
| 0.8638888888888889 | 0 |
| 0.8645833333333334 | 0 |
| 0.8652777777777777 | 0 |
| 0.8659722222222223 | 0 |
| 0.8666666666666667 | 0 |
| 0.8673611111111111 | 0 |
| 0.8680555555555555 | 0 |
| 0.86875 | 0 |
| 0.8694444444444445 | 0 |
| 0.8701388888888889 | 0 |
| 0.8708333333333332 | 0 |
| 0.8715277777777778 | 0 |
| 0.8722222222222222 | 0 |
| 0.8729166666666667 | 0 |
| 0.873611111111111 | 0 |
| 0.8743055555555556 | 0 |
| 0.875 | 0 |
| 0.8756944444444444 | 0 |
| 0.876388888888889 | 0 |
| 0.8770833333333333 | 0 |
| 0.8777777777777778 | 0 |
| 0.8784722222222222 | 0 |
| 0.8791666666666668 | 0 |
| 0.8798611111111111 | 0 |
| 0.8805555555555555 | 0 |
| 0.88125 | 0 |
| 0.8819444444444445 | 0 |
| 0.8826388888888889 | 0 |
| 0.8833333333333333 | 0 |
| 0.8840277777777777 | 0 |
| 0.8847222222222223 | 0 |
| 0.8854166666666666 | 0 |
| 0.8861111111111111 | 0 |
| 0.8868055555555556 | 0 |
| 0.8875000000000001 | 0 |
| 0.8881944444444444 | 0 |
| 0.8888888888888888 | 0 |
| 0.8895833333333334 | 0 |
| 0.8902777777777778 | 0 |
| 0.8909722222222222 | 0 |
| 0.8916666666666666 | 0 |
| 0.8923611111111112 | 0 |
| 0.8930555555555556 | 0 |
| 0.8937499999999999 | 0 |
| 0.8944444444444444 | 0 |
| 0.8951388888888889 | 0 |
| 0.8958333333333334 | 0 |
| 0.8965277777777777 | 0 |
| 0.8972222222222223 | 0 |
| 0.8979166666666667 | 0 |
| 0.8986111111111111 | 0 |
| 0.8993055555555555 | 0 |
| 0.9 | 0 |
| 0.9006944444444445 | 0 |
| 0.9013888888888889 | 0 |
| 0.9020833333333332 | 0 |
| 0.9027777777777778 | 0 |
| 0.9034722222222222 | 0 |
| 0.9041666666666667 | 0 |
| 0.904861111111111 | 0 |
| 0.9055555555555556 | 0 |
| 0.90625 | 0 |
| 0.9069444444444444 | 0 |
| 0.907638888888889 | 0 |
| 0.9083333333333333 | 0 |
| 0.9090277777777778 | 0 |
| 0.9097222222222222 | 0 |
| 0.9104166666666668 | 0 |
| 0.9111111111111111 | 0 |
| 0.9118055555555555 | 0 |
| 0.9125 | 0 |
| 0.9131944444444445 | 0 |
| 0.9138888888888889 | 0 |
| 0.9145833333333333 | 0 |
| 0.9152777777777777 | 0 |
| 0.9159722222222223 | 0 |
| 0.9166666666666666 | 0 |
| 0.9173611111111111 | 0 |
| 0.9180555555555556 | 0 |
| 0.9187500000000001 | 0 |
| 0.9194444444444444 | 0 |
| 0.9201388888888888 | 0 |
| 0.9208333333333334 | 0 |
| 0.9215277777777778 | 0 |
| 0.9222222222222222 | 0 |
| 0.9229166666666666 | 0 |
| 0.9236111111111112 | 0 |
| 0.9243055555555556 | 0 |
| 0.9249999999999999 | 0 |
| 0.9256944444444444 | 0 |
| 0.9263888888888889 | 0 |
| 0.9270833333333334 | 0 |
| 0.9277777777777777 | 0 |
| 0.9284722222222223 | 0 |
| 0.9291666666666667 | 0 |
| 0.9298611111111111 | 0 |
| 0.9305555555555555 | 0 |
| 0.93125 | 0 |
| 0.9319444444444445 | 0 |
| 0.9326388888888889 | 0 |
| 0.9333333333333332 | 0 |
| 0.9340277777777778 | 0 |
| 0.9347222222222222 | 0 |
| 0.9354166666666667 | 0 |
| 0.936111111111111 | 0 |
| 0.9368055555555556 | 0 |
| 0.9375 | 0 |
| 0.9381944444444444 | 0 |
| 0.938888888888889 | 0 |
| 0.9395833333333333 | 0 |
| 0.9402777777777778 | 0 |
| 0.9409722222222222 | 0 |
| 0.9416666666666668 | 0 |
| 0.9423611111111111 | 0 |
| 0.9430555555555555 | 0 |
| 0.94375 | 0 |
| 0.9444444444444445 | 0 |
| 0.9451388888888889 | 0 |
| 0.9458333333333333 | 0 |
| 0.9465277777777777 | 0 |
| 0.9472222222222223 | 0 |
| 0.9479166666666666 | 0 |
| 0.9486111111111111 | 0 |
| 0.9493055555555556 | 0 |
| 0.9500000000000001 | 0 |
| 0.9506944444444444 | 0 |
| 0.9513888888888888 | 0 |
| 0.9520833333333334 | 0 |
| 0.9527777777777778 | 0 |
| 0.9534722222222222 | 0 |
| 0.9541666666666666 | 0 |
| 0.9548611111111112 | 0 |
| 0.9555555555555556 | 0 |
| 0.9562499999999999 | 0 |
| 0.9569444444444444 | 0 |
| 0.9576388888888889 | 0 |
| 0.9583333333333334 | 0 |
| 0.9590277777777777 | 0 |
| 0.9597222222222223 | 0 |
| 0.9604166666666667 | 0 |
| 0.9611111111111111 | 0 |
| 0.9618055555555555 | 0 |
| 0.9625 | 0 |
| 0.9631944444444445 | 0 |
| 0.9638888888888889 | 0 |
| 0.9645833333333332 | 0 |
| 0.9652777777777778 | 0 |
| 0.9659722222222222 | 0 |
| 0.9666666666666667 | 0 |
| 0.967361111111111 | 0 |
| 0.9680555555555556 | 0 |
| 0.96875 | 0 |
| 0.9694444444444444 | 0 |
| 0.970138888888889 | 0 |
| 0.9708333333333333 | 0 |
| 0.9715277777777778 | 0 |
| 0.9722222222222222 | 0 |
| 0.9729166666666668 | 0 |
| 0.9736111111111111 | 0 |
| 0.9743055555555555 | 0 |
| 0.975 | 0 |
| 0.9756944444444445 | 0 |
| 0.9763888888888889 | 0 |
| 0.9770833333333333 | 0 |
| 0.9777777777777777 | 0 |
| 0.9784722222222223 | 0 |
| 0.9791666666666666 | 0 |
| 0.9798611111111111 | 0 |
| 0.9805555555555556 | 0 |
| 0.9812500000000001 | 0 |
| 0.9819444444444444 | 0 |
| 0.9826388888888888 | 0 |
| 0.9833333333333334 | 0 |
| 0.9840277777777778 | 0 |
| 0.9847222222222222 | 0 |
| 0.9854166666666666 | 0 |
| 0.9861111111111112 | 0 |
| 0.9868055555555556 | 0 |
| 0.9874999999999999 | 0 |
| 0.9881944444444444 | 0 |
| 0.9888888888888889 | 0 |
| 0.9895833333333334 | 0 |
| 0.9902777777777777 | 0 |
| 0.9909722222222223 | 0 |
| 0.9916666666666667 | 0 |
| 0.9923611111111111 | 0 |
| 0.9930555555555555 | 0 |
| 0.99375 | 0 |
| 0.9944444444444445 | 0 |
| 0.9951388888888889 | 0 |
| 0.9958333333333332 | 0 |
| 0.9965277777777778 | 0 |
| 0.9972222222222222 | 0 |
| 0.9979166666666667 | 0 |
| 0.998611111111111 | 0 |
| 0.9993055555555556 | 0 |